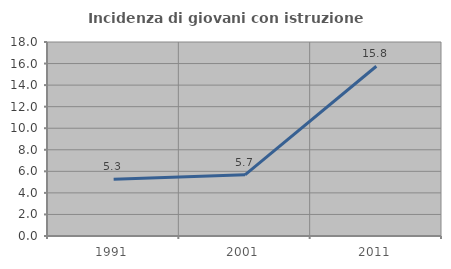
| Category | Incidenza di giovani con istruzione universitaria |
|---|---|
| 1991.0 | 5.274 |
| 2001.0 | 5.673 |
| 2011.0 | 15.751 |